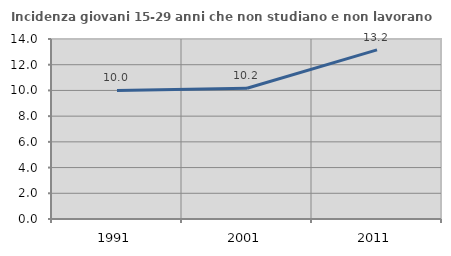
| Category | Incidenza giovani 15-29 anni che non studiano e non lavorano  |
|---|---|
| 1991.0 | 10 |
| 2001.0 | 10.169 |
| 2011.0 | 13.158 |